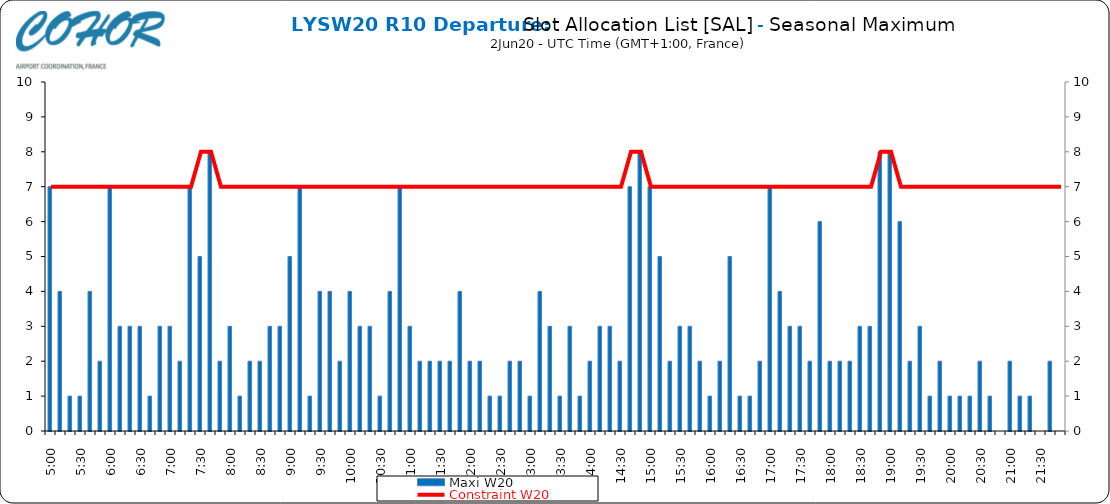
| Category | Maxi W20 |
|---|---|
| 0.20833333333333334 | 7 |
| 0.2152777777777778 | 4 |
| 0.2222222222222222 | 1 |
| 0.22916666666666666 | 1 |
| 0.23611111111111113 | 4 |
| 0.24305555555555555 | 2 |
| 0.25 | 7 |
| 0.2569444444444445 | 3 |
| 0.2638888888888889 | 3 |
| 0.2708333333333333 | 3 |
| 0.2777777777777778 | 1 |
| 0.2847222222222222 | 3 |
| 0.2916666666666667 | 3 |
| 0.2986111111111111 | 2 |
| 0.3055555555555555 | 7 |
| 0.3125 | 5 |
| 0.3194444444444445 | 8 |
| 0.3263888888888889 | 2 |
| 0.3333333333333333 | 3 |
| 0.34027777777777773 | 1 |
| 0.34722222222222227 | 2 |
| 0.3541666666666667 | 2 |
| 0.3611111111111111 | 3 |
| 0.3680555555555556 | 3 |
| 0.375 | 5 |
| 0.3819444444444444 | 7 |
| 0.3888888888888889 | 1 |
| 0.3958333333333333 | 4 |
| 0.40277777777777773 | 4 |
| 0.40972222222222227 | 2 |
| 0.4166666666666667 | 4 |
| 0.4236111111111111 | 3 |
| 0.4305555555555556 | 3 |
| 0.4375 | 1 |
| 0.4444444444444444 | 4 |
| 0.4513888888888889 | 7 |
| 0.4583333333333333 | 3 |
| 0.46527777777777773 | 2 |
| 0.47222222222222227 | 2 |
| 0.4791666666666667 | 2 |
| 0.4861111111111111 | 2 |
| 0.4930555555555556 | 4 |
| 0.5 | 2 |
| 0.5069444444444444 | 2 |
| 0.513888888888889 | 1 |
| 0.5208333333333334 | 1 |
| 0.5277777777777778 | 2 |
| 0.5347222222222222 | 2 |
| 0.5416666666666666 | 1 |
| 0.548611111111111 | 4 |
| 0.5555555555555556 | 3 |
| 0.5625 | 1 |
| 0.5694444444444444 | 3 |
| 0.576388888888889 | 1 |
| 0.5833333333333334 | 2 |
| 0.5902777777777778 | 3 |
| 0.5972222222222222 | 3 |
| 0.6041666666666666 | 2 |
| 0.611111111111111 | 7 |
| 0.6180555555555556 | 8 |
| 0.625 | 7 |
| 0.6319444444444444 | 5 |
| 0.638888888888889 | 2 |
| 0.6458333333333334 | 3 |
| 0.6527777777777778 | 3 |
| 0.6597222222222222 | 2 |
| 0.6666666666666666 | 1 |
| 0.6736111111111112 | 2 |
| 0.6805555555555555 | 5 |
| 0.6875 | 1 |
| 0.6944444444444445 | 1 |
| 0.7013888888888888 | 2 |
| 0.7083333333333334 | 7 |
| 0.7152777777777778 | 4 |
| 0.7222222222222222 | 3 |
| 0.7291666666666666 | 3 |
| 0.7361111111111112 | 2 |
| 0.7430555555555555 | 6 |
| 0.75 | 2 |
| 0.7569444444444445 | 2 |
| 0.7638888888888888 | 2 |
| 0.7708333333333334 | 3 |
| 0.7777777777777778 | 3 |
| 0.7847222222222222 | 8 |
| 0.7916666666666666 | 8 |
| 0.7986111111111112 | 6 |
| 0.8055555555555555 | 2 |
| 0.8125 | 3 |
| 0.8194444444444445 | 1 |
| 0.8263888888888888 | 2 |
| 0.8333333333333334 | 1 |
| 0.8402777777777778 | 1 |
| 0.8472222222222222 | 1 |
| 0.8541666666666666 | 2 |
| 0.8611111111111112 | 1 |
| 0.8680555555555555 | 0 |
| 0.875 | 2 |
| 0.8819444444444445 | 1 |
| 0.8888888888888888 | 1 |
| 0.8958333333333334 | 0 |
| 0.9027777777777778 | 2 |
| 0.9097222222222222 | 0 |